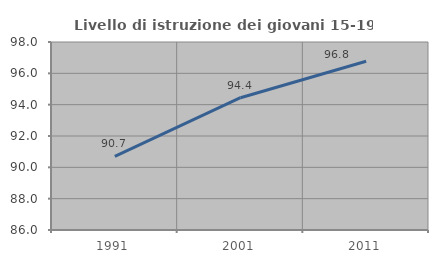
| Category | Livello di istruzione dei giovani 15-19 anni |
|---|---|
| 1991.0 | 90.698 |
| 2001.0 | 94.444 |
| 2011.0 | 96.774 |